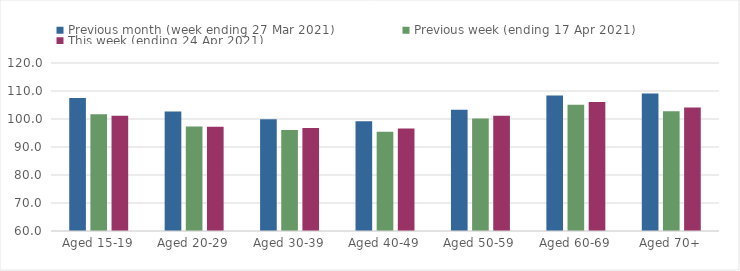
| Category | Previous month (week ending 27 Mar 2021) | Previous week (ending 17 Apr 2021) | This week (ending 24 Apr 2021) |
|---|---|---|---|
| Aged 15-19 | 107.48 | 101.66 | 101.2 |
| Aged 20-29 | 102.71 | 97.31 | 97.26 |
| Aged 30-39 | 99.95 | 96.09 | 96.75 |
| Aged 40-49 | 99.21 | 95.41 | 96.61 |
| Aged 50-59 | 103.32 | 100.14 | 101.16 |
| Aged 60-69 | 108.41 | 105.06 | 106.09 |
| Aged 70+ | 109.11 | 102.75 | 104.07 |